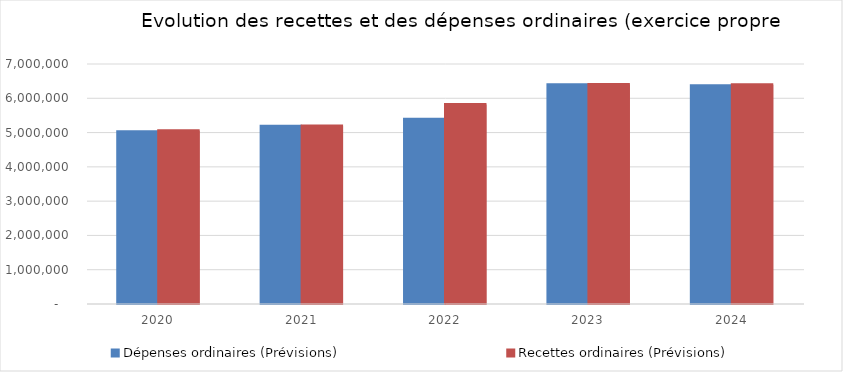
| Category | Dépenses ordinaires (Prévisions) | Recettes ordinaires (Prévisions) |
|---|---|---|
| 2020.0 | 5023023.1 | 5050405.16 |
| 2021.0 | 5187591.22 | 5189368.7 |
| 2022.0 | 5388677.62 | 5820562.41 |
| 2023.0 | 6395641.14 | 6401554.33 |
| 2024.0 | 6368876.57 | 6393349.08 |